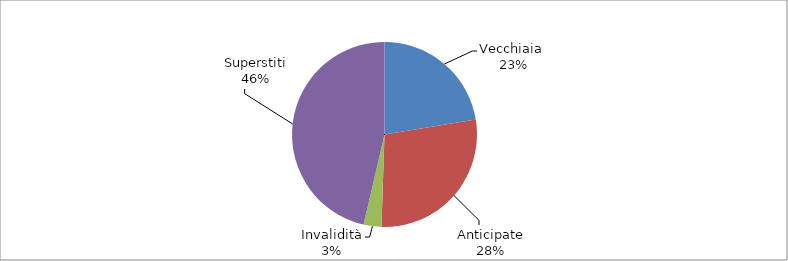
| Category | Series 0 |
|---|---|
| Vecchiaia  | 9295 |
| Anticipate | 11646 |
| Invalidità | 1290 |
| Superstiti | 19218 |